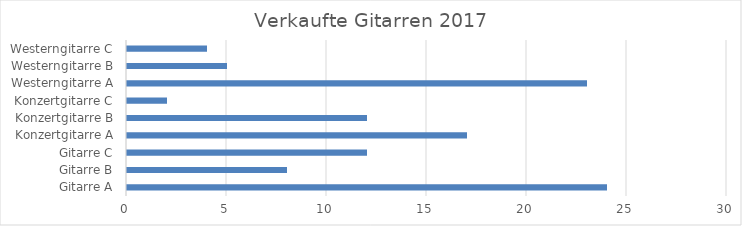
| Category | Anzahl |
|---|---|
| Gitarre A | 24 |
| Gitarre B | 8 |
| Gitarre C | 12 |
| Konzertgitarre A | 17 |
| Konzertgitarre B | 12 |
| Konzertgitarre C | 2 |
| Westerngitarre A | 23 |
| Westerngitarre B | 5 |
| Westerngitarre C | 4 |